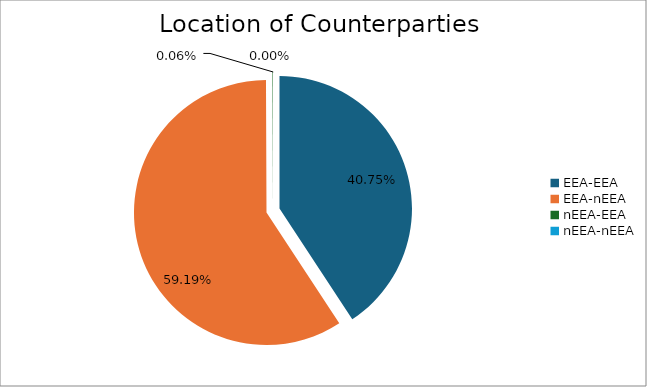
| Category | Series 0 |
|---|---|
| EEA-EEA | 5201155.444 |
| EEA-nEEA | 7555720.076 |
| nEEA-EEA | 7611.986 |
| nEEA-nEEA | 378.609 |